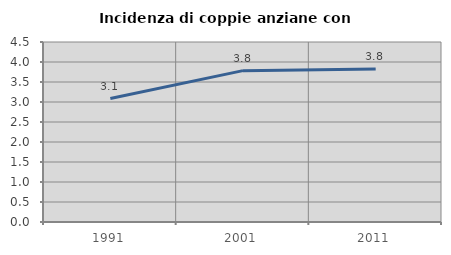
| Category | Incidenza di coppie anziane con figli |
|---|---|
| 1991.0 | 3.086 |
| 2001.0 | 3.784 |
| 2011.0 | 3.825 |